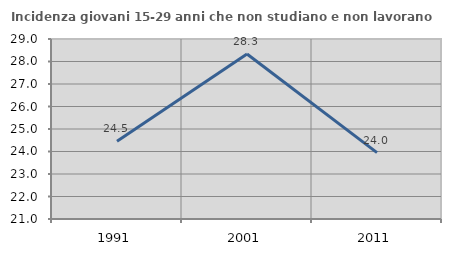
| Category | Incidenza giovani 15-29 anni che non studiano e non lavorano  |
|---|---|
| 1991.0 | 24.451 |
| 2001.0 | 28.333 |
| 2011.0 | 23.952 |